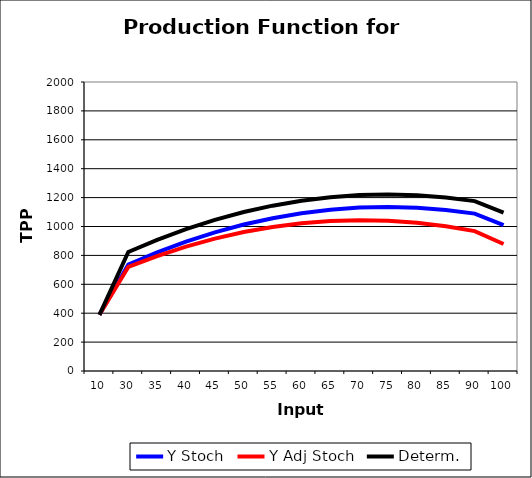
| Category | Y Stoch | Y Adj Stoch | Determ. |
|---|---|---|---|
| 10.0 | 388.966 | 388.966 | 388.966 |
| 30.0 | 737.3 | 719.983 | 823.88 |
| 35.0 | 821.214 | 795.239 | 907.794 |
| 40.0 | 895.202 | 860.57 | 981.782 |
| 45.0 | 959.264 | 915.974 | 1045.845 |
| 50.0 | 1013.401 | 961.452 | 1099.981 |
| 55.0 | 1057.611 | 997.005 | 1144.192 |
| 60.0 | 1091.896 | 1022.632 | 1178.477 |
| 65.0 | 1116.255 | 1038.332 | 1202.836 |
| 70.0 | 1130.688 | 1044.107 | 1217.269 |
| 75.0 | 1135.195 | 1039.957 | 1221.776 |
| 80.0 | 1129.777 | 1025.88 | 1216.357 |
| 85.0 | 1114.432 | 1001.877 | 1201.013 |
| 90.0 | 1089.162 | 967.949 | 1175.742 |
| 100.0 | 1008.844 | 878.973 | 1095.424 |